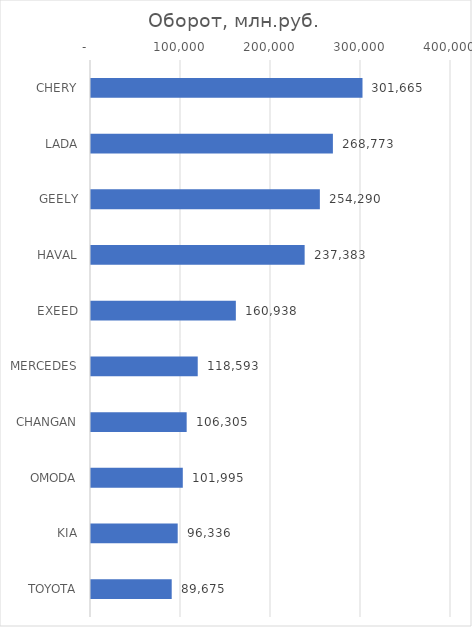
| Category | Оборот, млн.руб. |
|---|---|
| CHERY | 301665.399 |
| LADA | 268773.187 |
| GEELY | 254289.77 |
| HAVAL | 237382.784 |
| EXEED | 160937.581 |
| MERCEDES | 118592.849 |
| CHANGAN | 106304.928 |
| OMODA | 101995.128 |
| KIA | 96335.72 |
| TOYOTA | 89675.383 |